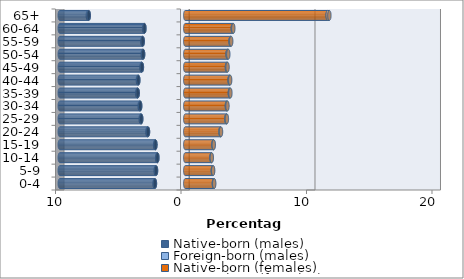
| Category | Native-born (males) | Foreign-born (males) | Native-born (females) | Foreign-born (females) |
|---|---|---|---|---|
| 0-4 | -2.417 | -0.029 | 2.282 | 0.027 |
| 5-9 | -2.329 | -0.027 | 2.199 | 0.025 |
| 10-14 | -2.22 | -0.019 | 2.093 | 0.017 |
| 15-19 | -2.376 | -0.026 | 2.247 | 0.022 |
| 20-24 | -2.968 | -0.047 | 2.809 | 0.041 |
| 25-29 | -3.507 | -0.047 | 3.275 | 0.043 |
| 30-34 | -3.591 | -0.047 | 3.319 | 0.046 |
| 35-39 | -3.788 | -0.044 | 3.554 | 0.046 |
| 40-44 | -3.739 | -0.038 | 3.536 | 0.043 |
| 45-49 | -3.455 | -0.035 | 3.323 | 0.048 |
| 50-54 | -3.357 | -0.034 | 3.374 | 0.057 |
| 55-59 | -3.389 | -0.027 | 3.611 | 0.052 |
| 60-64 | -3.254 | -0.022 | 3.789 | 0.041 |
| 65+ | -7.689 | -0.077 | 11.348 | 0.138 |